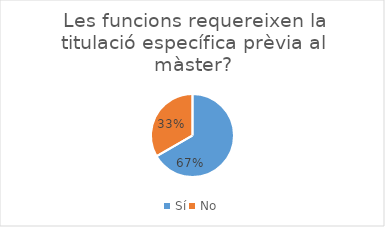
| Category | Series 0 |
|---|---|
| Sí | 26 |
| No | 13 |